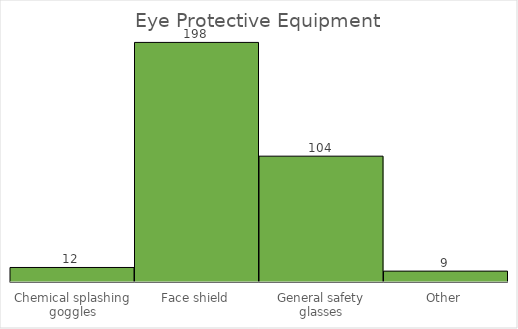
| Category | N⁰ of Equipment |
|---|---|
| Chemical splashing goggles | 12 |
| Face shield | 198 |
| General safety glasses | 104 |
| Other | 9 |